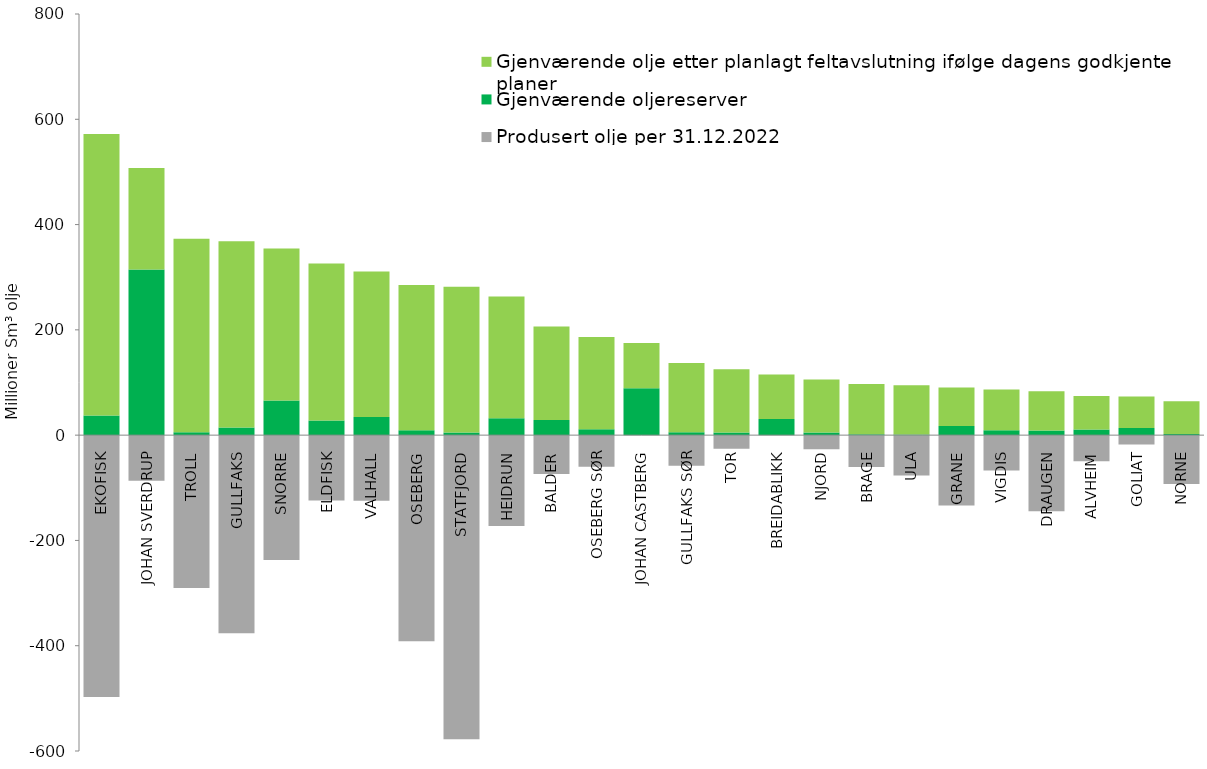
| Category | Produsert olje per 31.12.2022 | Gjenværende oljereserver | Gjenværende olje etter planlagt feltavslutning ifølge dagens godkjente planer |
|---|---|---|---|
| EKOFISK | -497.19 | 37.54 | 534.37 |
| JOHAN SVERDRUP | -86.76 | 314.6 | 192.74 |
| TROLL | -290.56 | 5.54 | 367.4 |
| GULLFAKS | -376.13 | 14.35 | 354.12 |
| SNORRE | -236.95 | 65.76 | 288.59 |
| ELDFISK | -124.27 | 27.9 | 298.02 |
| VALHALL | -124.48 | 34.26 | 276.45 |
| OSEBERG | -391.36 | 9.27 | 275.77 |
| STATFJORD | -577.84 | 5 | 276.97 |
| HEIDRUN | -172.44 | 32.1 | 231.27 |
| BALDER | -73.82 | 28.99 | 177.5 |
| OSEBERG SØR | -60.07 | 11.39 | 175.14 |
| JOHAN CASTBERG | 0 | 88.97 | 86.27 |
| GULLFAKS SØR | -58.22 | 5.26 | 131.69 |
| TOR | -25.99 | 5.22 | 120.04 |
| BREIDABLIKK | 0 | 30.47 | 84.64 |
| NJORD | -26.68 | 4.98 | 100.53 |
| BRAGE | -60.34 | 1.88 | 95.14 |
| ULA | -76.65 | 1 | 93.59 |
| GRANE | -133.58 | 17.27 | 73.15 |
| VIGDIS | -67.15 | 9.12 | 77.37 |
| DRAUGEN | -144.54 | 9.04 | 74.17 |
| ALVHEIM | -49.55 | 10.92 | 63.46 |
| GOLIAT | -17.73 | 13.6 | 59.88 |
| NORNE | -92.64 | 2.02 | 62.33 |